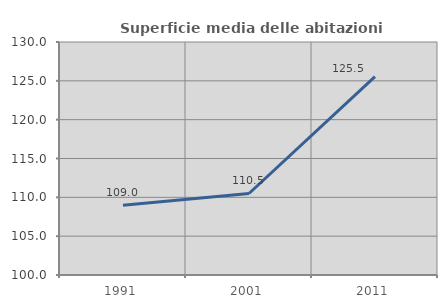
| Category | Superficie media delle abitazioni occupate |
|---|---|
| 1991.0 | 108.978 |
| 2001.0 | 110.495 |
| 2011.0 | 125.548 |